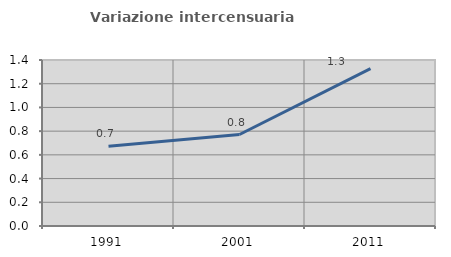
| Category | Variazione intercensuaria annua |
|---|---|
| 1991.0 | 0.674 |
| 2001.0 | 0.771 |
| 2011.0 | 1.328 |